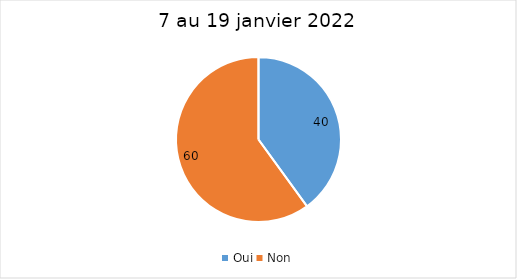
| Category | 7 au 19 janvier 2022 |
|---|---|
| Oui | 40 |
| Non | 60 |